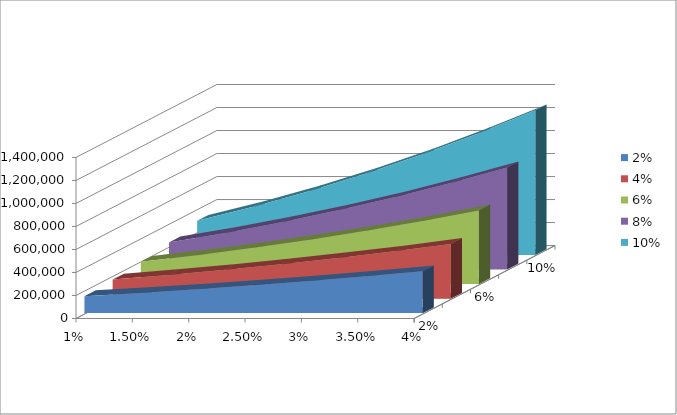
| Category | 2% | 4% | 6% | 8% | 10% |
|---|---|---|---|---|---|
| 0.01 | 146921.71 | 165453.589 | 192973.761 | 234062.591 | 295633.899 |
| 0.015 | 175147.788 | 205206.872 | 249897.323 | 316678.42 | 416805.756 |
| 0.02 | 206551 | 249644 | 313779 | 409684 | 553548 |
| 0.025 | 241130 | 298766 | 384618 | 513079 | 705859 |
| 0.03 | 278887 | 352573 | 462415 | 626864 | 873741 |
| 0.035 | 319820 | 411063 | 547169 | 751039 | 1057193 |
| 0.04 | 363930 | 474238 | 638882 | 885603 | 1256214 |